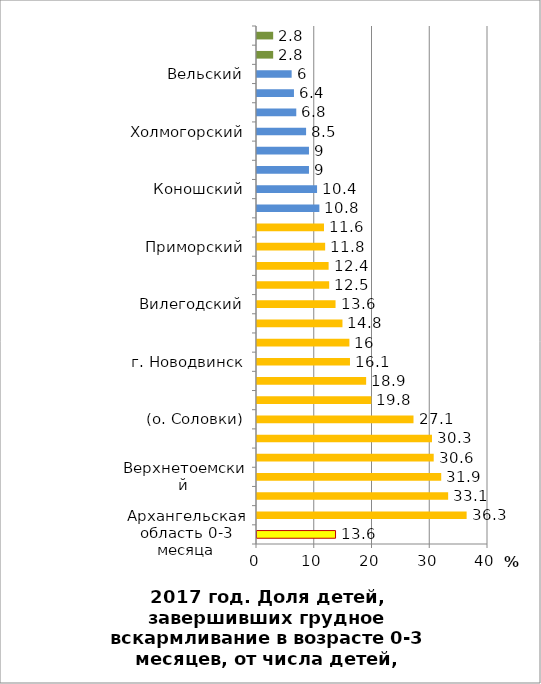
| Category | Series 0 |
|---|---|
| Архангельская область 0-3 месяца | 13.6 |
| Виноградовский | 36.3 |
| Шенкурский | 33.1 |
| Верхнетоемский | 31.9 |
| Мезенский | 30.6 |
| Областные организации  | 30.3 |
| (о. Соловки) | 27.1 |
| г. Коряжма | 19.8 |
| Красноборский | 18.9 |
| г. Новодвинск | 16.1 |
| г. Архангельск | 16 |
| г. Мирный | 14.8 |
| Вилегодский | 13.6 |
| г. Северодвинск | 12.5 |
| г. Котлас | 12.4 |
| Приморский | 11.8 |
| Лешуконский | 11.6 |
| Плесецкий | 10.8 |
| Коношский | 10.4 |
| Устьянский | 9 |
| Ленский | 9 |
| Холмогорский | 8.5 |
| Онежский | 6.8 |
| Каргопольский | 6.4 |
| Вельский | 6 |
| Няндомский | 2.8 |
| Пинежский | 2.8 |